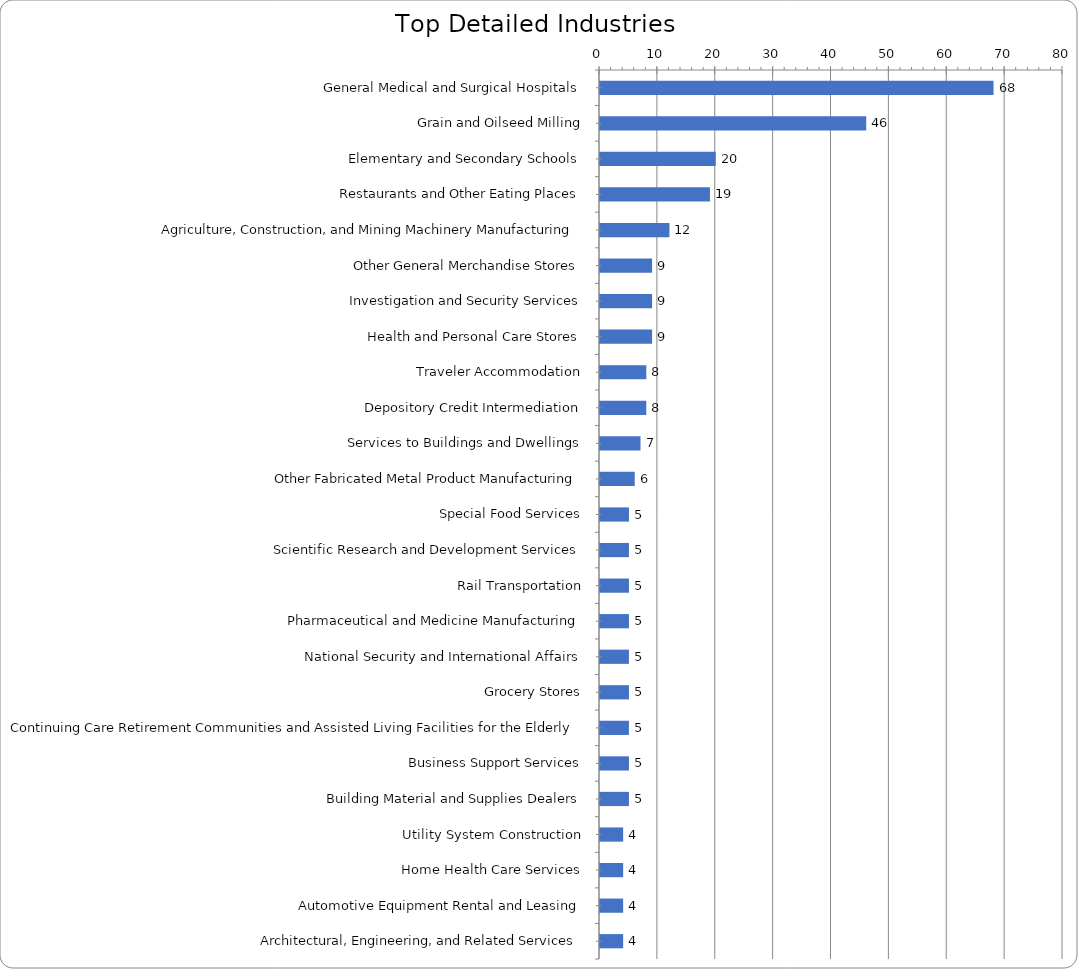
| Category | Series 0 |
|---|---|
| General Medical and Surgical Hospitals | 68 |
| Grain and Oilseed Milling | 46 |
| Elementary and Secondary Schools | 20 |
| Restaurants and Other Eating Places | 19 |
| Agriculture, Construction, and Mining Machinery Manufacturing | 12 |
| Other General Merchandise Stores | 9 |
| Investigation and Security Services | 9 |
| Health and Personal Care Stores | 9 |
| Traveler Accommodation | 8 |
| Depository Credit Intermediation | 8 |
| Services to Buildings and Dwellings | 7 |
| Other Fabricated Metal Product Manufacturing | 6 |
| Special Food Services | 5 |
| Scientific Research and Development Services | 5 |
| Rail Transportation | 5 |
| Pharmaceutical and Medicine Manufacturing | 5 |
| National Security and International Affairs | 5 |
| Grocery Stores | 5 |
| Continuing Care Retirement Communities and Assisted Living Facilities for the Elderly | 5 |
| Business Support Services | 5 |
| Building Material and Supplies Dealers | 5 |
| Utility System Construction | 4 |
| Home Health Care Services | 4 |
| Automotive Equipment Rental and Leasing | 4 |
| Architectural, Engineering, and Related Services | 4 |